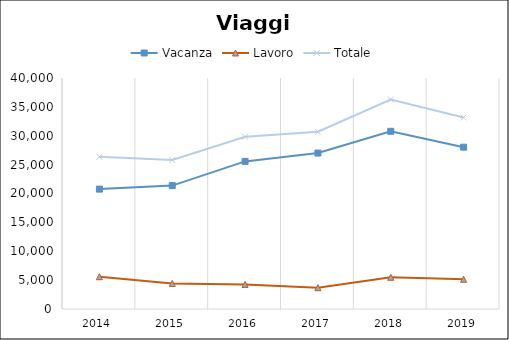
| Category | Vacanza | Lavoro | Totale |
|---|---|---|---|
| 2014.0 | 20760 | 5592 | 26352 |
| 2015.0 | 21366 | 4437 | 25803 |
| 2016.0 | 25561 | 4258 | 29819 |
| 2017.0 | 27002 | 3692 | 30694 |
| 2018.0 | 30768 | 5495 | 36263 |
| 2019.0 | 28022 | 5149 | 33171 |